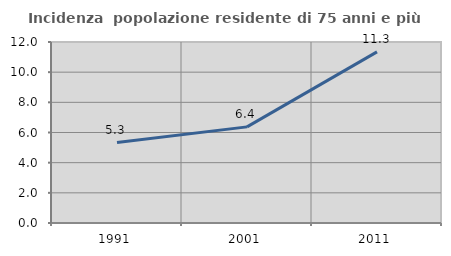
| Category | Incidenza  popolazione residente di 75 anni e più |
|---|---|
| 1991.0 | 5.331 |
| 2001.0 | 6.373 |
| 2011.0 | 11.345 |